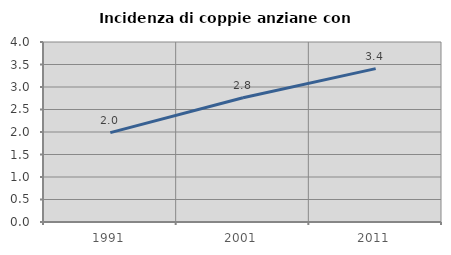
| Category | Incidenza di coppie anziane con figli |
|---|---|
| 1991.0 | 1.987 |
| 2001.0 | 2.761 |
| 2011.0 | 3.408 |